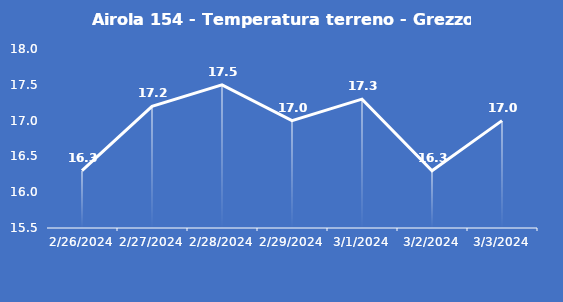
| Category | Airola 154 - Temperatura terreno - Grezzo (°C) |
|---|---|
| 2/26/24 | 16.3 |
| 2/27/24 | 17.2 |
| 2/28/24 | 17.5 |
| 2/29/24 | 17 |
| 3/1/24 | 17.3 |
| 3/2/24 | 16.3 |
| 3/3/24 | 17 |